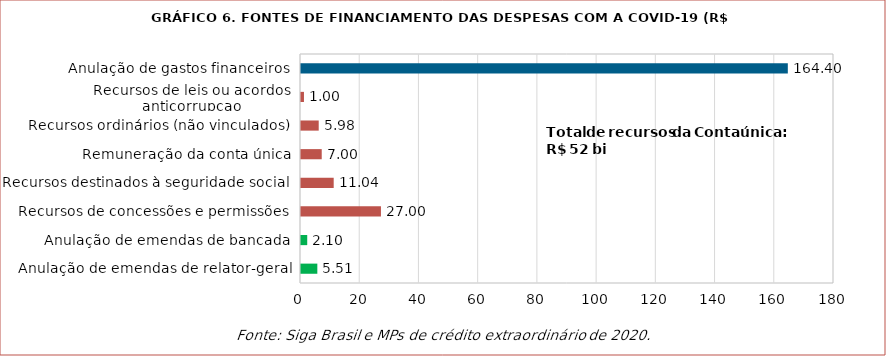
| Category | Valores |
|---|---|
| Anulação de emendas de relator-geral | 5.513 |
| Anulação de emendas de bancada | 2.101 |
| Recursos de concessões e permissões | 27 |
| Recursos destinados à seguridade social | 11.042 |
| Remuneração da conta única | 7 |
| Recursos ordinários (não vinculados) | 5.982 |
| Recursos de leis ou acordos anticorrupcao | 1.002 |
| Anulação de gastos financeiros | 164.404 |